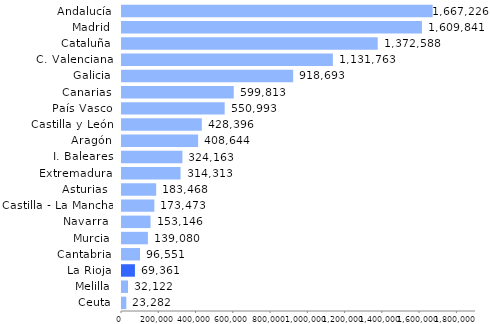
| Category | Series 0 |
|---|---|
| Ceuta | 23281.879 |
| Melilla | 32122.335 |
| La Rioja | 69361.261 |
| Cantabria | 96551.066 |
| Murcia | 139080.24 |
| Navarra  | 153145.702 |
| Castilla - La Mancha | 173473.343 |
| Asturias  | 183467.939 |
| Extremadura | 314312.878 |
| I. Baleares | 324163.258 |
| Aragón | 408644.15 |
| Castilla y León | 428396.468 |
| País Vasco | 550992.77 |
| Canarias | 599813.292 |
| Galicia | 918693.196 |
| C. Valenciana | 1131762.887 |
| Cataluña | 1372587.932 |
| Madrid | 1609841.291 |
| Andalucía | 1667225.926 |